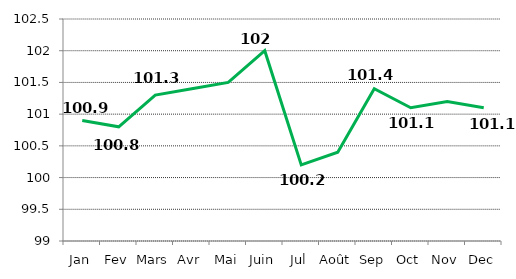
| Category |   INDICE  GENERAL     |
|---|---|
| Jan | 100.9 |
| Fev | 100.8 |
| Mars | 101.3 |
| Avr | 101.4 |
| Mai | 101.5 |
| Juin | 102 |
| Jul | 100.2 |
| Août | 100.4 |
| Sep | 101.4 |
| Oct | 101.1 |
| Nov | 101.2 |
| Dec | 101.1 |